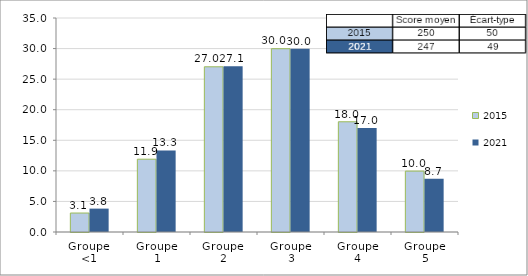
| Category | 2015 | 2021 |
|---|---|---|
| Groupe 
<1 | 3.104 | 3.825 |
| Groupe 
1 | 11.907 | 13.334 |
| Groupe 
2 | 27.022 | 27.117 |
| Groupe 
3 | 29.98 | 29.973 |
| Groupe
4 | 18.029 | 17.029 |
| Groupe 
5 | 9.959 | 8.722 |